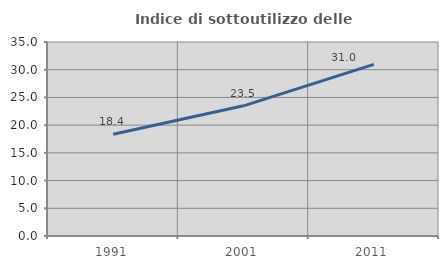
| Category | Indice di sottoutilizzo delle abitazioni  |
|---|---|
| 1991.0 | 18.352 |
| 2001.0 | 23.489 |
| 2011.0 | 30.967 |